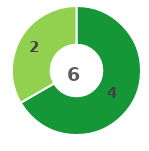
| Category | Series 0 |
|---|---|
| 0 | 4 |
| 1 | 2 |
| 2 | 0 |
| 3 | 0 |
| 4 | 0 |